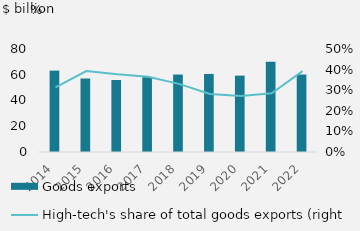
| Category | Goods exports |
|---|---|
| 2014 | 63220.1 |
| 2015 | 57075.9 |
| 2016 | 55928.5 |
| 2017 | 58178.9 |
| 2018 | 60170.7 |
| 2019 | 60630.1 |
| 2020 | 59322.7 |
| 2021 | 70133.3 |
| 2022 | 60174.4 |